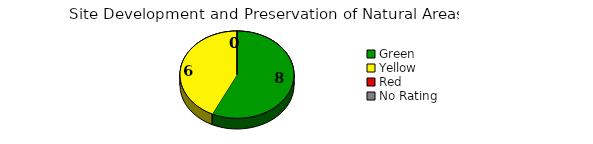
| Category | Counts |
|---|---|
| Green | 8 |
| Yellow | 6 |
| Red | 0 |
| No Rating | 0 |